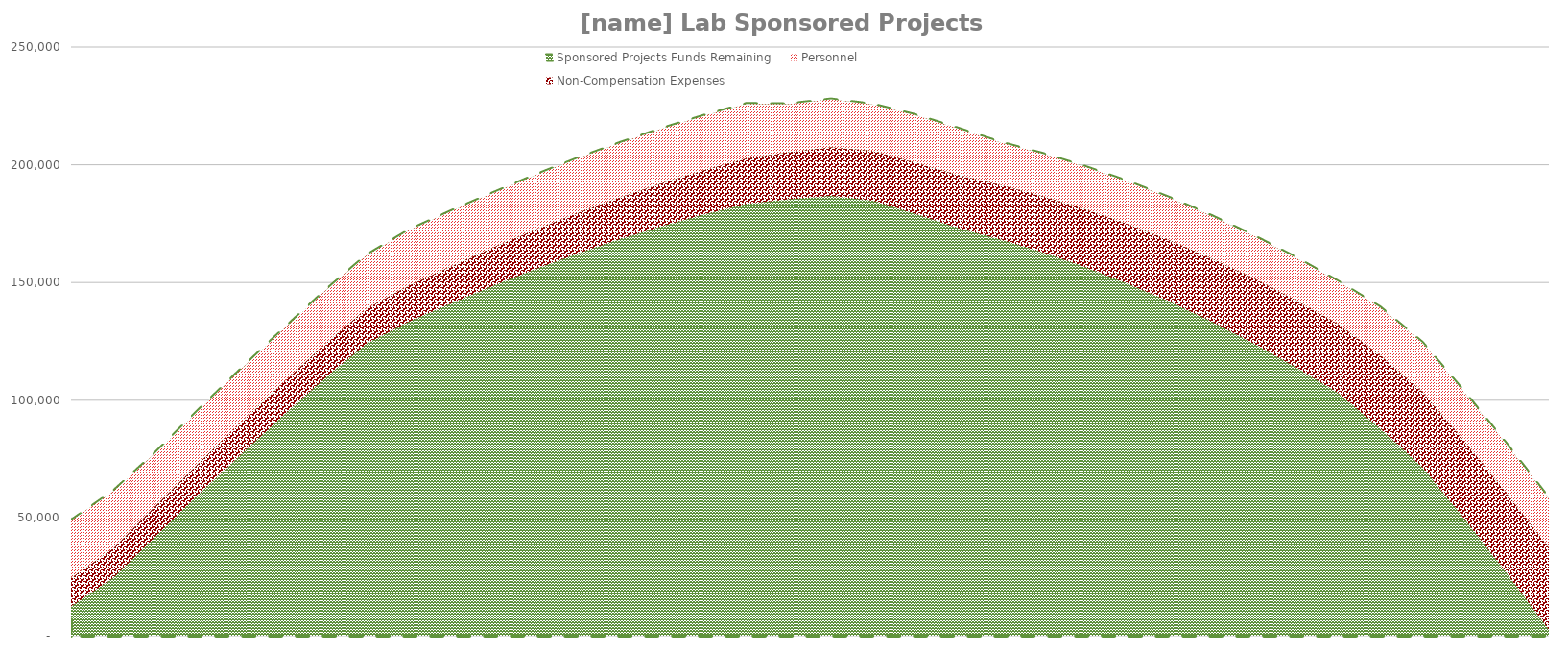
| Category | Sponsored Projects Funds Remaining | Personnel | Non-Compensation Expenses |
|---|---|---|---|
| 2019-11-01 | 48813.278 | -24298.65 | -12063 |
| 2019-12-01 | 61264.906 | -24298.65 | -12424.89 |
| 2020-01-01 | 77639.714 | -22586.55 | -12797.637 |
| 2020-02-01 | 95353.876 | -22586.55 | -13181.566 |
| 2020-03-01 | 112684.108 | -22586.55 | -13577.013 |
| 2020-04-01 | 129618.893 | -22586.55 | -13984.323 |
| 2020-05-01 | 146146.368 | -22586.55 | -14403.853 |
| 2020-06-01 | 161502.967 | -22586.55 | -14835.968 |
| 2020-07-01 | 172117.665 | -23481.682 | -15281.047 |
| 2020-08-01 | 180281.013 | -23481.682 | -15739.479 |
| 2020-09-01 | 187985.929 | -23135.345 | -16211.663 |
| 2020-10-01 | 195564.998 | -23135.345 | -16698.013 |
| 2020-11-01 | 202657.717 | -23135.345 | -17198.954 |
| 2020-12-01 | 209249.496 | -23135.345 | -17714.922 |
| 2021-01-01 | 215325.307 | -23135.345 | -18246.37 |
| 2021-02-01 | 220869.669 | -23135.345 | -18793.761 |
| 2021-03-01 | 225866.641 | -23135.345 | -19357.574 |
| 2021-04-01 | 225701.413 | -20364.645 | -19938.301 |
| 2021-05-01 | 227726.158 | -20364.645 | -20536.45 |
| 2021-06-01 | 225545.087 | -19671.97 | -21152.544 |
| 2021-07-01 | 221063.938 | -20178.362 | -21787.12 |
| 2021-08-01 | 215441.821 | -19817.23 | -22440.733 |
| 2021-09-01 | 209527.222 | -18035.105 | -23113.955 |
| 2021-10-01 | 204721.526 | -18035.105 | -23807.374 |
| 2021-11-01 | 199222.411 | -18035.105 | -24521.595 |
| 2021-12-01 | 193009.075 | -18035.105 | -25257.243 |
| 2022-01-01 | 186060.092 | -18035.105 | -26014.96 |
| 2022-02-01 | 178353.391 | -18035.105 | -26795.409 |
| 2022-03-01 | 169866.241 | -18035.105 | -27599.272 |
| 2022-04-01 | 160575.229 | -18035.105 | -28427.25 |
| 2022-05-01 | 150456.239 | -18035.105 | -29280.067 |
| 2022-06-01 | 139484.431 | -20285.105 | -31075.136 |
| 2022-07-01 | 124467.555 | -20795.532 | -31979.89 |
| 2022-08-01 | 103331.58 | -20795.532 | -32911.787 |
| 2022-09-01 | 81263.709 | -20795.532 | -33871.64 |
| 2022-10-01 | 58235.984 | -20795.532 | -34860.289 |